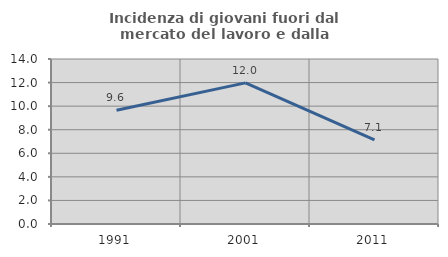
| Category | Incidenza di giovani fuori dal mercato del lavoro e dalla formazione  |
|---|---|
| 1991.0 | 9.649 |
| 2001.0 | 11.976 |
| 2011.0 | 7.143 |